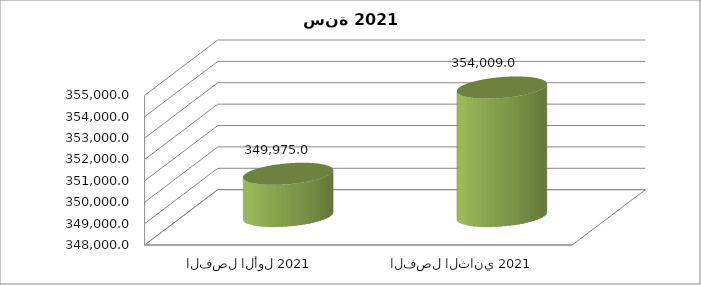
| Category | Series 0 |
|---|---|
| الفصل الأول 2021 | 349975 |
| الفصل الثاني 2021 | 354009 |